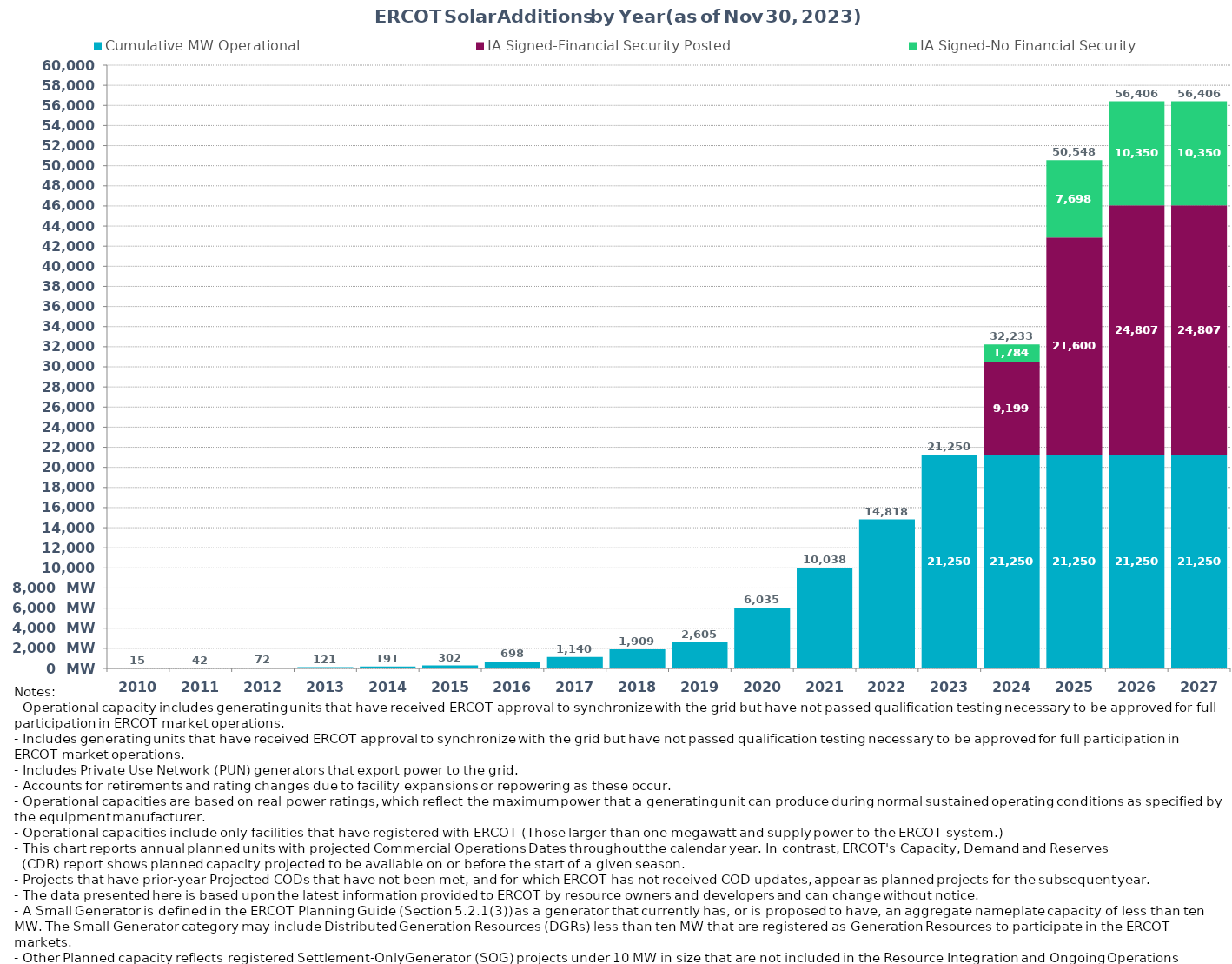
| Category | Cumulative MW Operational | IA Signed-Financial Security Posted  | IA Signed-No Financial Security  | Other Planned | Cumulative Installed and Planned |
|---|---|---|---|---|---|
| 2010.0 | 14.9 | 0 | 0 | 0 | 14.9 |
| 2011.0 | 41.6 | 0 | 0 | 0 | 41.6 |
| 2012.0 | 72 | 0 | 0 | 0 | 72 |
| 2013.0 | 121.18 | 0 | 0 | 0 | 121.18 |
| 2014.0 | 190.7 | 0 | 0 | 0 | 190.7 |
| 2015.0 | 301.71 | 0 | 0 | 0 | 301.71 |
| 2016.0 | 698.22 | 0 | 0 | 0 | 698.22 |
| 2017.0 | 1140.12 | 0 | 0 | 0 | 1140.12 |
| 2018.0 | 1909.16 | 0 | 0 | 0 | 1909.16 |
| 2019.0 | 2605.35 | 0 | 0 | 0 | 2605.35 |
| 2020.0 | 6034.64 | 0 | 0 | 0 | 6034.64 |
| 2021.0 | 10038.12 | 0 | 0 | 0 | 10038.12 |
| 2022.0 | 14818.22 | 0 | 0 | 0 | 14818.22 |
| 2023.0 | 21249.66 | 0 | 0 | 0 | 21249.66 |
| 2024.0 | 21249.66 | 9199.46 | 1784.22 | 0 | 32233.34 |
| 2025.0 | 21249.66 | 21600.45 | 7698.33 | 0 | 50548.44 |
| 2026.0 | 21249.66 | 24806.86 | 10349.8 | 0 | 56406.32 |
| 2027.0 | 21249.66 | 24806.86 | 10349.8 | 0 | 56406.32 |